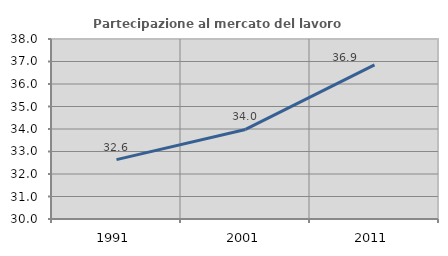
| Category | Partecipazione al mercato del lavoro  femminile |
|---|---|
| 1991.0 | 32.637 |
| 2001.0 | 33.98 |
| 2011.0 | 36.851 |